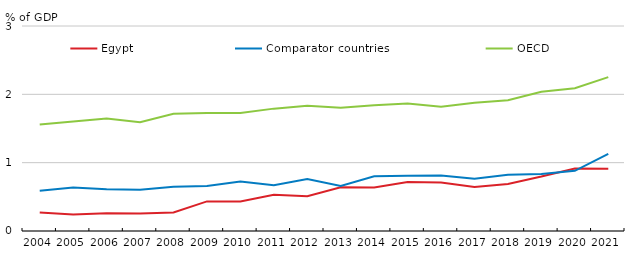
| Category | Egypt | Comparator countries | OECD |
|---|---|---|---|
| 2004.0 | 0.27 | 0.589 | 1.558 |
| 2005.0 | 0.241 | 0.635 | 1.603 |
| 2006.0 | 0.259 | 0.611 | 1.646 |
| 2007.0 | 0.255 | 0.605 | 1.591 |
| 2008.0 | 0.27 | 0.648 | 1.717 |
| 2009.0 | 0.433 | 0.658 | 1.725 |
| 2010.0 | 0.433 | 0.724 | 1.728 |
| 2011.0 | 0.532 | 0.67 | 1.791 |
| 2012.0 | 0.509 | 0.76 | 1.834 |
| 2013.0 | 0.639 | 0.66 | 1.804 |
| 2014.0 | 0.636 | 0.802 | 1.842 |
| 2015.0 | 0.719 | 0.807 | 1.865 |
| 2016.0 | 0.708 | 0.812 | 1.818 |
| 2017.0 | 0.645 | 0.764 | 1.876 |
| 2018.0 | 0.688 | 0.823 | 1.915 |
| 2019.0 | 0.796 | 0.835 | 2.038 |
| 2020.0 | 0.916 | 0.881 | 2.089 |
| 2021.0 | 0.912 | 1.128 | 2.252 |